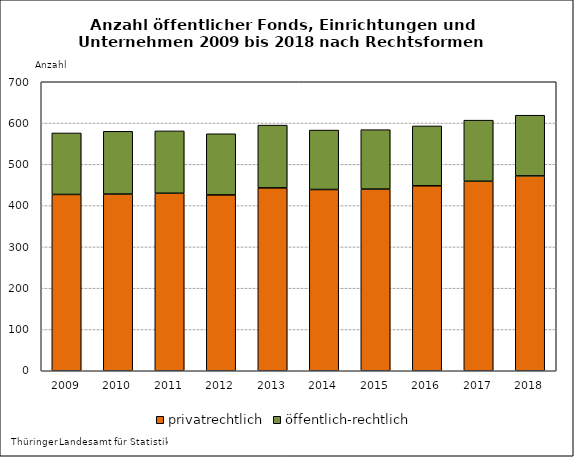
| Category | privatrechtlich | öffentlich-rechtlich |
|---|---|---|
| 2009.0 | 427 | 149 |
| 2010.0 | 428 | 152 |
| 2011.0 | 430 | 151 |
| 2012.0 | 426 | 148 |
| 2013.0 | 443 | 152 |
| 2014.0 | 439 | 144 |
| 2015.0 | 440 | 144 |
| 2016.0 | 448 | 145 |
| 2017.0 | 459 | 148 |
| 2018.0 | 472 | 147 |